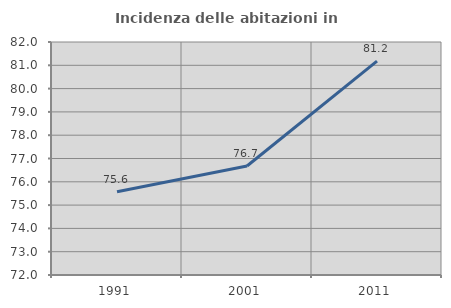
| Category | Incidenza delle abitazioni in proprietà  |
|---|---|
| 1991.0 | 75.576 |
| 2001.0 | 76.68 |
| 2011.0 | 81.181 |